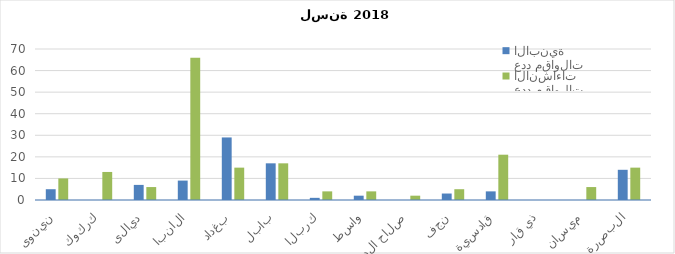
| Category | عدد مقاولات الابنية | عدد مقاولات الانشاءات |
|---|---|---|
| نينوى | 5 | 10 |
| كركوك | 0 | 13 |
| ديالى | 7 | 6 |
| الانبار | 9 | 66 |
| بغداد | 29 | 15 |
| بابل | 17 | 17 |
| كربلاء | 1 | 4 |
| واسط | 2 | 4 |
| صلاح الدين | 0 | 2 |
| نجف | 3 | 5 |
| قادسية | 4 | 21 |
| ذي قار | 0 | 0 |
| ميسان | 0 | 6 |
| البصرة | 14 | 15 |